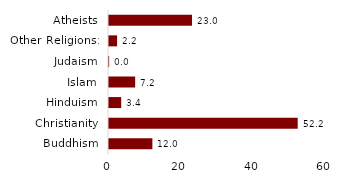
| Category | Series 0 |
|---|---|
| Buddhism | 11.993 |
| Christianity | 52.174 |
| Hinduism | 3.37 |
| Islam | 7.235 |
| Judaism | 0.039 |
| Other Religions: | 2.236 |
| Atheists | 22.953 |